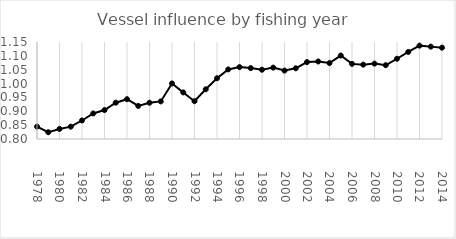
| Category | Series 0 |
|---|---|
| 1978.0 | 0.845 |
| 1979.0 | 0.824 |
| 1980.0 | 0.836 |
| 1981.0 | 0.845 |
| 1982.0 | 0.867 |
| 1983.0 | 0.892 |
| 1984.0 | 0.904 |
| 1985.0 | 0.931 |
| 1986.0 | 0.944 |
| 1987.0 | 0.919 |
| 1988.0 | 0.931 |
| 1989.0 | 0.936 |
| 1990.0 | 1 |
| 1991.0 | 0.968 |
| 1992.0 | 0.936 |
| 1993.0 | 0.979 |
| 1994.0 | 1.019 |
| 1995.0 | 1.051 |
| 1996.0 | 1.059 |
| 1997.0 | 1.056 |
| 1998.0 | 1.05 |
| 1999.0 | 1.058 |
| 2000.0 | 1.047 |
| 2001.0 | 1.055 |
| 2002.0 | 1.078 |
| 2003.0 | 1.08 |
| 2004.0 | 1.074 |
| 2005.0 | 1.101 |
| 2006.0 | 1.071 |
| 2007.0 | 1.068 |
| 2008.0 | 1.072 |
| 2009.0 | 1.066 |
| 2010.0 | 1.09 |
| 2011.0 | 1.114 |
| 2012.0 | 1.137 |
| 2013.0 | 1.133 |
| 2014.0 | 1.13 |